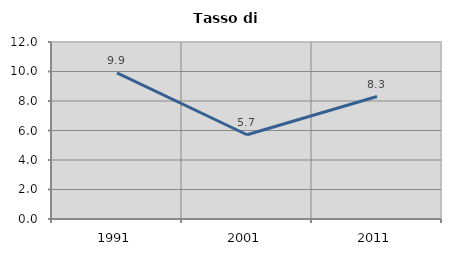
| Category | Tasso di disoccupazione   |
|---|---|
| 1991.0 | 9.905 |
| 2001.0 | 5.712 |
| 2011.0 | 8.303 |